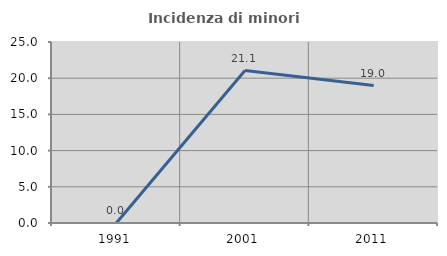
| Category | Incidenza di minori stranieri |
|---|---|
| 1991.0 | 0 |
| 2001.0 | 21.053 |
| 2011.0 | 18.987 |